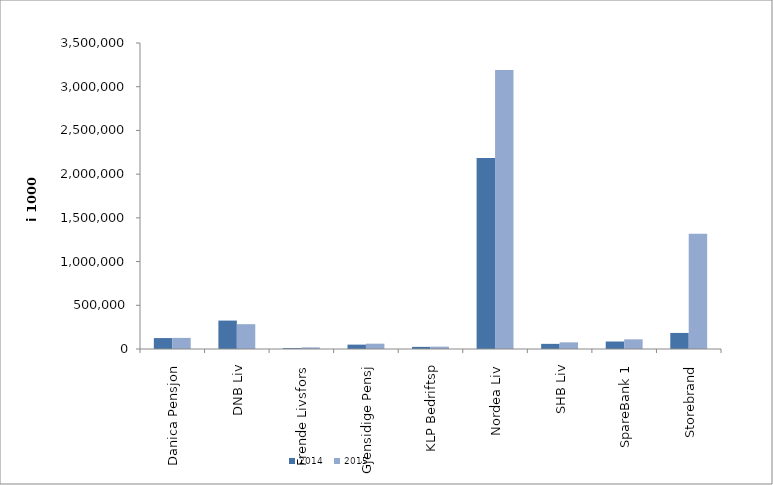
| Category | 2014 | 2015 |
|---|---|---|
| Danica Pensjon | 124999.566 | 126991.561 |
| DNB Liv | 324963.371 | 283953.425 |
| Frende Livsfors | 10105 | 18492 |
| Gjensidige Pensj | 50093.096 | 60909.403 |
| KLP Bedriftsp | 24395 | 26845 |
| Nordea Liv | 2184429.012 | 3190586.2 |
| SHB Liv | 58798 | 76080 |
| SpareBank 1 | 85744 | 110433 |
| Storebrand | 183737.769 | 1318961.352 |